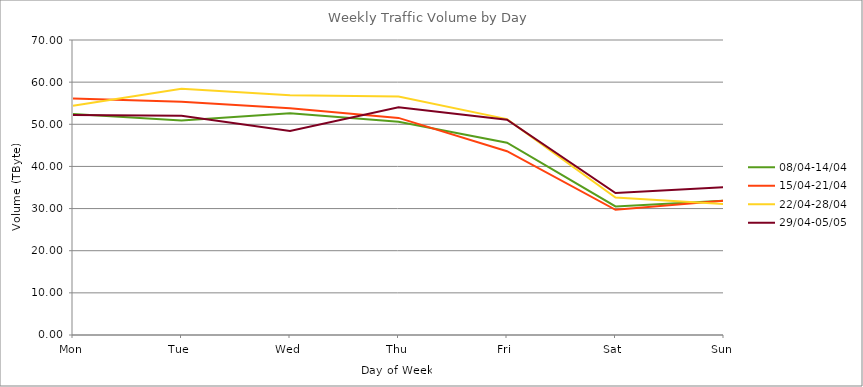
| Category | 08/04-14/04 | 15/04-21/04 | 22/04-28/04 | 29/04-05/05 |
|---|---|---|---|---|
| Mon | 52.43 | 56.11 | 54.4 | 52.18 |
| Tue | 50.88 | 55.33 | 58.43 | 52.02 |
| Wed | 52.61 | 53.78 | 56.87 | 48.43 |
| Thu | 50.58 | 51.52 | 56.59 | 54.03 |
| Fri | 45.62 | 43.62 | 51.22 | 51.1 |
| Sat | 30.52 | 29.7 | 32.6 | 33.68 |
| Sun | 31.86 | 31.86 | 31.09 | 35.08 |